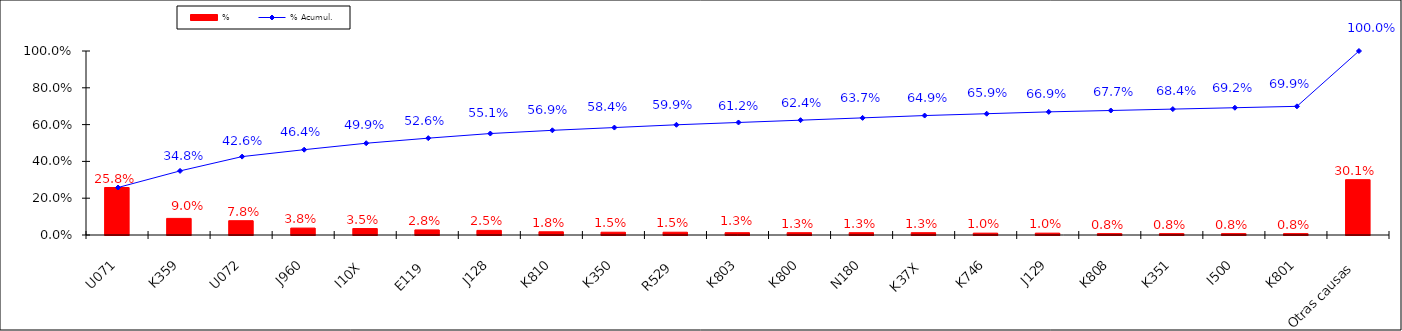
| Category | % |
|---|---|
| U071 | 0.258 |
| K359 | 0.09 |
| U072 | 0.078 |
| J960 | 0.038 |
| I10X | 0.035 |
| E119 | 0.028 |
| J128 | 0.025 |
| K810 | 0.018 |
| K350 | 0.015 |
| R529 | 0.015 |
| K803 | 0.013 |
| K800 | 0.013 |
| N180 | 0.013 |
| K37X | 0.013 |
| K746 | 0.01 |
| J129 | 0.01 |
| K808 | 0.008 |
| K351 | 0.008 |
| I500 | 0.008 |
| K801 | 0.008 |
| Otras causas | 0.301 |